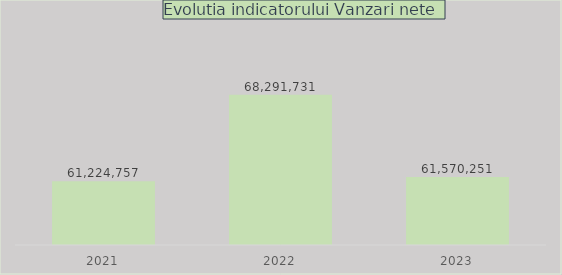
| Category | Series 0 |
|---|---|
| 2021.0 | 61224757 |
| 2022.0 | 68291731.2 |
| 2023.0 | 61570251 |